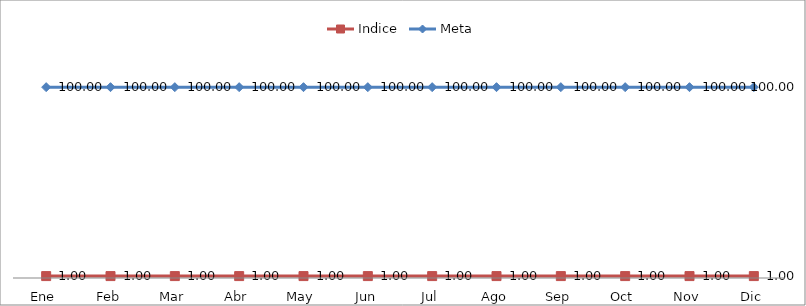
| Category | Indice | Meta |
|---|---|---|
| Ene | 1 | 100 |
| Feb | 1 | 100 |
| Mar | 1 | 100 |
| Abr | 1 | 100 |
| May | 1 | 100 |
| Jun | 1 | 100 |
| Jul | 1 | 100 |
| Ago | 1 | 100 |
| Sep | 1 | 100 |
| Oct | 1 | 100 |
| Nov | 1 | 100 |
| Dic | 1 | 100 |